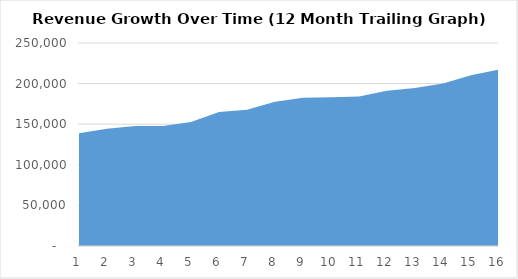
| Category | Series 0 |
|---|---|
| 0 | 138989 |
| 1 | 144319 |
| 2 | 147729 |
| 3 | 147872 |
| 4 | 152725 |
| 5 | 165027 |
| 6 | 167782 |
| 7 | 177782 |
| 8 | 182482 |
| 9 | 183162 |
| 10 | 184185 |
| 11 | 191049 |
| 12 | 194496 |
| 13 | 200242 |
| 14 | 210376 |
| 15 | 217252 |